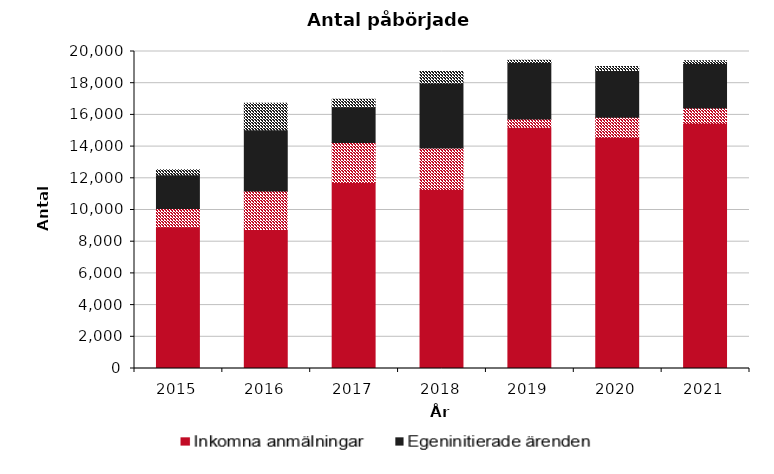
| Category | Inkomna anmälningar | Uppräkning | Egeninitierade ärenden |
|---|---|---|---|
| 2015 | 8941 | 319 | 2132 |
| 2016 | 8771 | 1682 | 3860 |
| 2017 | 11738 | 481 | 2253 |
| 2018 | 11290 | 715 | 4109 |
| 2019 | 15214 | 146 | 3566 |
| 2020 | 14588 | 254 | 2954 |
| 2021 | 15480 | 175 | 2808 |